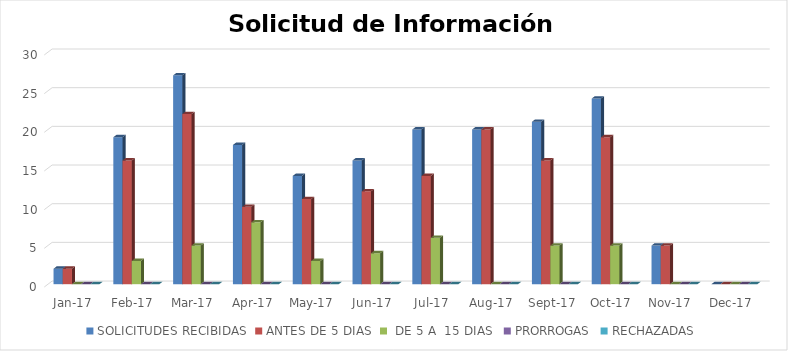
| Category | SOLICITUDES RECIBIDAS | ANTES DE 5 DIAS |  DE 5 A  15 DIAS  | PRORROGAS | RECHAZADAS |
|---|---|---|---|---|---|
| 2017-01-01 | 2 | 2 | 0 | 0 | 0 |
| 2017-02-01 | 19 | 16 | 3 | 0 | 0 |
| 2017-03-01 | 27 | 22 | 5 | 0 | 0 |
| 2017-04-01 | 18 | 10 | 8 | 0 | 0 |
| 2017-05-01 | 14 | 11 | 3 | 0 | 0 |
| 2017-06-01 | 16 | 12 | 4 | 0 | 0 |
| 2017-07-01 | 20 | 14 | 6 | 0 | 0 |
| 2017-08-01 | 20 | 20 | 0 | 0 | 0 |
| 2017-09-01 | 21 | 16 | 5 | 0 | 0 |
| 2017-10-01 | 24 | 19 | 5 | 0 | 0 |
| 2017-11-01 | 5 | 5 | 0 | 0 | 0 |
| 2017-12-01 | 0 | 0 | 0 | 0 | 0 |